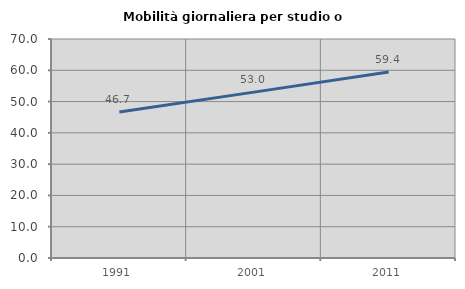
| Category | Mobilità giornaliera per studio o lavoro |
|---|---|
| 1991.0 | 46.701 |
| 2001.0 | 53.017 |
| 2011.0 | 59.423 |